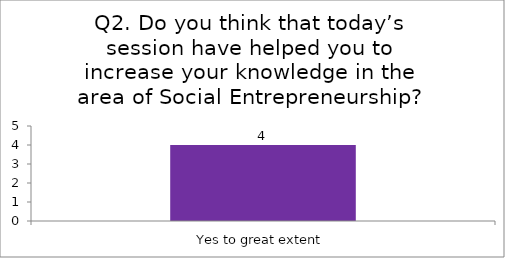
| Category | Q2. Do you think that today’s session have helped you to increase your knowledge in the area of Social Entrepreneurship? |
|---|---|
| Yes to great extent | 4 |